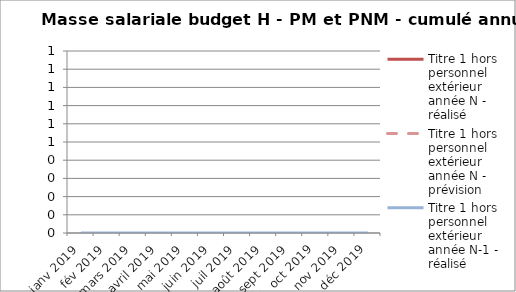
| Category | Titre 1 hors personnel extérieur année N - réalisé | Titre 1 hors personnel extérieur année N - prévision | Titre 1 hors personnel extérieur année N-1 - réalisé |
|---|---|---|---|
| janv 2019 |  |  | 0 |
| fév 2019 |  |  | 0 |
| mars 2019 |  |  | 0 |
| avril 2019 |  |  | 0 |
| mai 2019 |  |  | 0 |
| juin 2019 |  |  | 0 |
| juil 2019 |  |  | 0 |
| août 2019 |  |  | 0 |
| sept 2019 |  |  | 0 |
| oct 2019 |  |  | 0 |
| nov 2019 |  |  | 0 |
| déc 2019 |  |  | 0 |